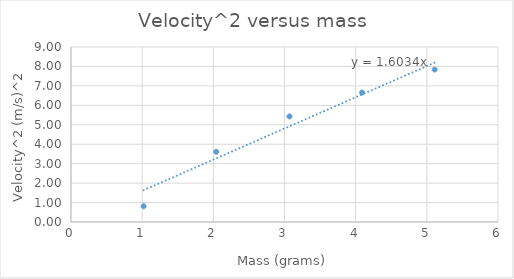
| Category | Velocity^2 (m/s)^2 |
|---|---|
| 1.02 | 0.81 |
| 2.04 | 3.61 |
| 3.07 | 5.429 |
| 4.09 | 6.656 |
| 5.11 | 7.84 |